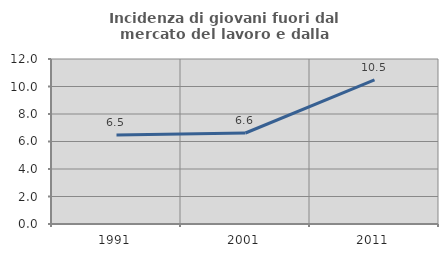
| Category | Incidenza di giovani fuori dal mercato del lavoro e dalla formazione  |
|---|---|
| 1991.0 | 6.466 |
| 2001.0 | 6.618 |
| 2011.0 | 10.48 |